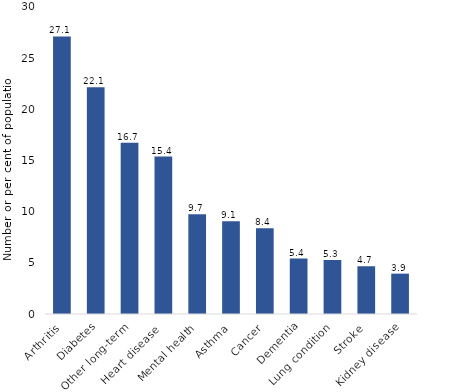
| Category | Series 0 |
|---|---|
| Arthritis | 27.129 |
| Diabetes | 22.146 |
| Other long-term | 16.744 |
| Heart disease  | 15.389 |
| Mental health | 9.74 |
| Asthma | 9.069 |
| Cancer | 8.368 |
| Dementia | 5.42 |
| Lung condition | 5.268 |
| Stroke | 4.666 |
| Kidney disease | 3.944 |